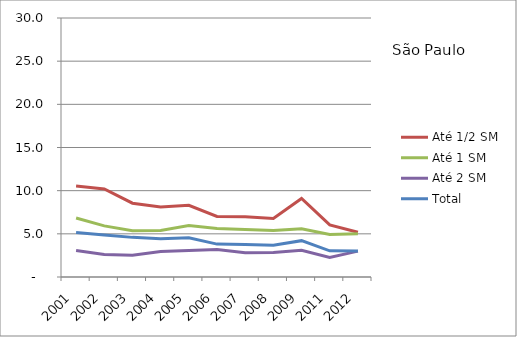
| Category | Até 1/2 SM | Até 1 SM | Até 2 SM | Total |
|---|---|---|---|---|
| 2001.0 | 10.53 | 6.84 | 3.06 | 5.16 |
| 2002.0 | 10.2 | 5.92 | 2.61 | 4.86 |
| 2003.0 | 8.55 | 5.36 | 2.52 | 4.59 |
| 2004.0 | 8.12 | 5.39 | 2.95 | 4.44 |
| 2005.0 | 8.31 | 5.95 | 3.08 | 4.55 |
| 2006.0 | 7.01 | 5.61 | 3.19 | 3.81 |
| 2007.0 | 6.97 | 5.5 | 2.81 | 3.77 |
| 2008.0 | 6.78 | 5.39 | 2.85 | 3.69 |
| 2009.0 | 9.1 | 5.59 | 3.09 | 4.21 |
| 2011.0 | 6.04 | 4.92 | 2.27 | 3.03 |
| 2012.0 | 5.18 | 5.02 | 3 | 3.02 |